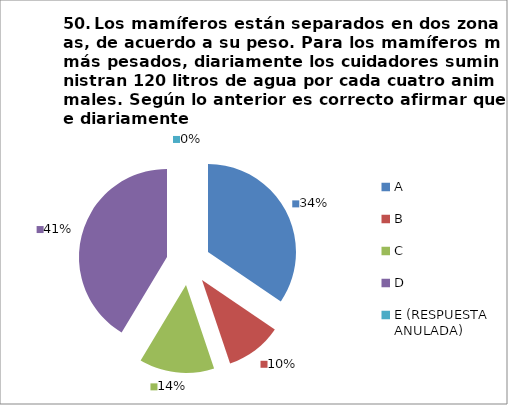
| Category | CANTIDAD DE RESPUESTAS PREGUNTA (50) | PORCENTAJE |
|---|---|---|
| A | 10 | 0.345 |
| B | 3 | 0.103 |
| C | 4 | 0.138 |
| D | 12 | 0.414 |
| E (RESPUESTA ANULADA) | 0 | 0 |